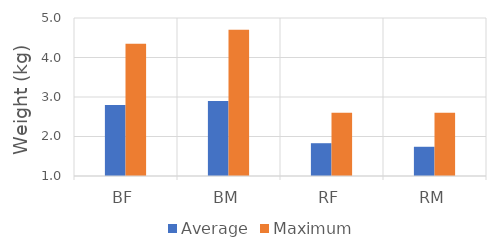
| Category | Average | Maximum |
|---|---|---|
| BF | 2.8 | 4.35 |
| BM | 2.9 | 4.7 |
| RF | 1.83 | 2.6 |
| RM | 1.74 | 2.6 |